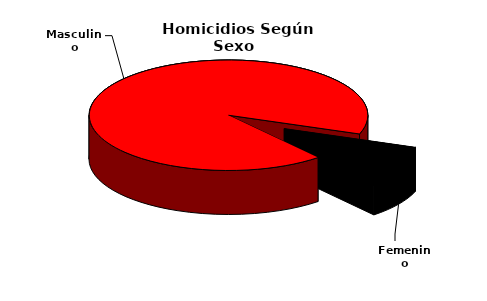
| Category | Masculino | Femenino |
|---|---|---|
| Masculino | 2176 | 2271 |
| Femenino | 199 | 201 |